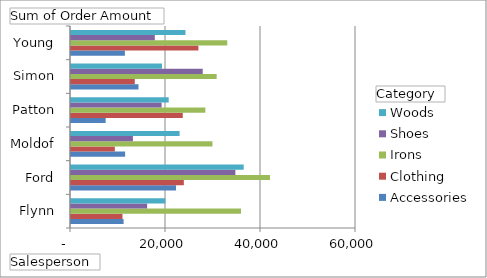
| Category | Accessories | Clothing | Irons | Shoes | Woods |
|---|---|---|---|---|---|
| Flynn | 11070.93 | 10833.91 | 35793.68 | 16027.88 | 19862.6 |
| Ford | 22108.74 | 23754.27 | 41890.7 | 34607.06 | 36361.37 |
| Moldof | 11389.51 | 9228.17 | 29782.9 | 13035.68 | 22862.58 |
| Patton | 7296.02 | 23530.28 | 28286.2 | 19076.14 | 20566.63 |
| Simon | 14206.5 | 13428.6 | 30664.38 | 27732.4 | 19160.76 |
| Young | 11347.96 | 26822.65 | 32896.24 | 17646.99 | 24098.88 |